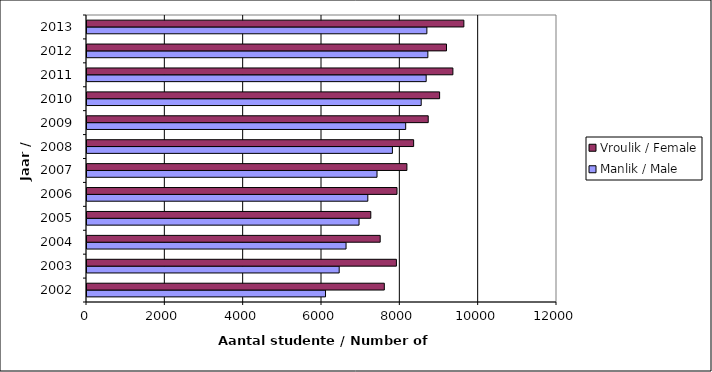
| Category | Manlik / Male | Vroulik / Female |
|---|---|---|
| 2002.0 | 6090 | 7591 |
| 2003.0 | 6439 | 7900 |
| 2004.0 | 6614 | 7486 |
| 2005.0 | 6946 | 7246 |
| 2006.0 | 7170 | 7915 |
| 2007.0 | 7405 | 8168 |
| 2008.0 | 7798 | 8340 |
| 2009.0 | 8137 | 8712 |
| 2010.0 | 8533 | 9003 |
| 2011.0 | 8660 | 9342 |
| 2012.0 | 8703 | 9179 |
| 2013.0 | 8678 | 9622 |